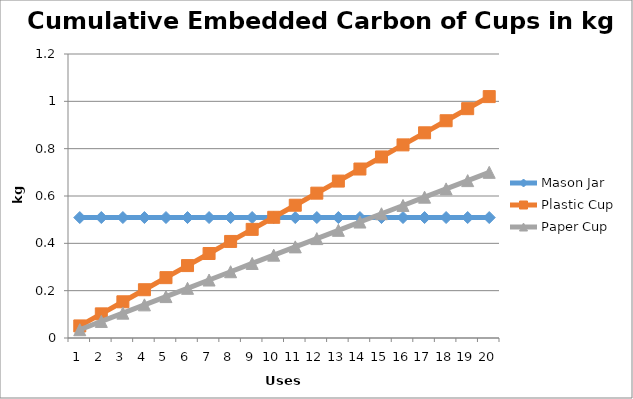
| Category | Mason Jar | Plastic Cup | Paper Cup |
|---|---|---|---|
| 0 | 0.509 | 0.051 | 0.035 |
| 1 | 0.509 | 0.102 | 0.07 |
| 2 | 0.509 | 0.153 | 0.105 |
| 3 | 0.509 | 0.204 | 0.14 |
| 4 | 0.509 | 0.255 | 0.175 |
| 5 | 0.509 | 0.306 | 0.21 |
| 6 | 0.509 | 0.357 | 0.245 |
| 7 | 0.509 | 0.408 | 0.28 |
| 8 | 0.509 | 0.459 | 0.315 |
| 9 | 0.509 | 0.51 | 0.35 |
| 10 | 0.509 | 0.561 | 0.385 |
| 11 | 0.509 | 0.612 | 0.42 |
| 12 | 0.509 | 0.663 | 0.455 |
| 13 | 0.509 | 0.714 | 0.49 |
| 14 | 0.509 | 0.765 | 0.525 |
| 15 | 0.509 | 0.816 | 0.56 |
| 16 | 0.509 | 0.867 | 0.595 |
| 17 | 0.509 | 0.918 | 0.63 |
| 18 | 0.509 | 0.969 | 0.665 |
| 19 | 0.509 | 1.02 | 0.7 |